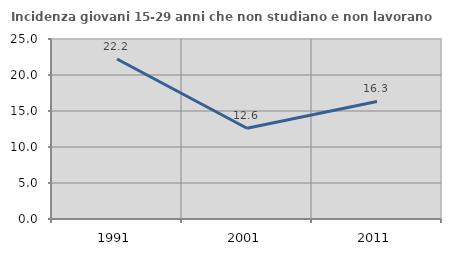
| Category | Incidenza giovani 15-29 anni che non studiano e non lavorano  |
|---|---|
| 1991.0 | 22.222 |
| 2001.0 | 12.598 |
| 2011.0 | 16.327 |